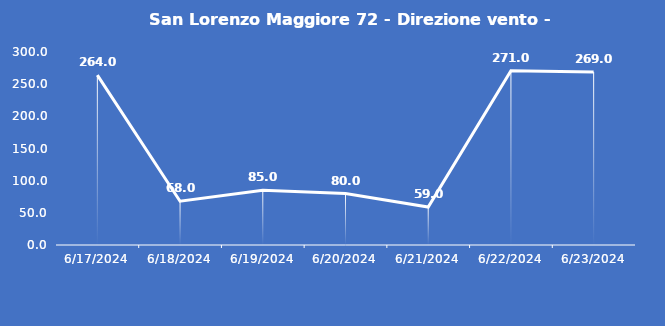
| Category | San Lorenzo Maggiore 72 - Direzione vento - Grezzo (°N) |
|---|---|
| 6/17/24 | 264 |
| 6/18/24 | 68 |
| 6/19/24 | 85 |
| 6/20/24 | 80 |
| 6/21/24 | 59 |
| 6/22/24 | 271 |
| 6/23/24 | 269 |